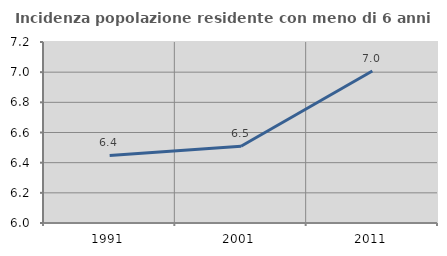
| Category | Incidenza popolazione residente con meno di 6 anni |
|---|---|
| 1991.0 | 6.448 |
| 2001.0 | 6.508 |
| 2011.0 | 7.008 |